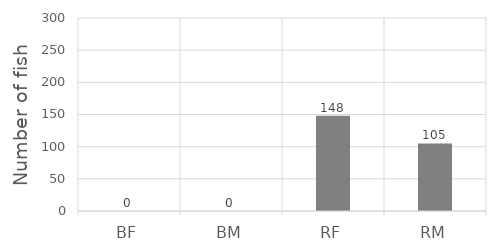
| Category | Series 0 |
|---|---|
| BF | 0 |
| BM | 0 |
| RF | 148 |
| RM | 105 |